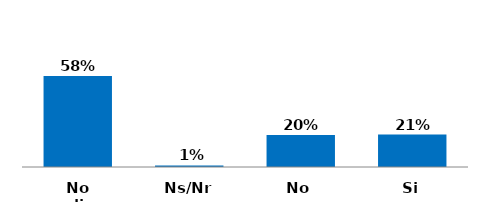
| Category | Series 0 |
|---|---|
| Si | 0.207 |
| No | 0.203 |
| Ns/Nr | 0.01 |
| No aplica | 0.58 |